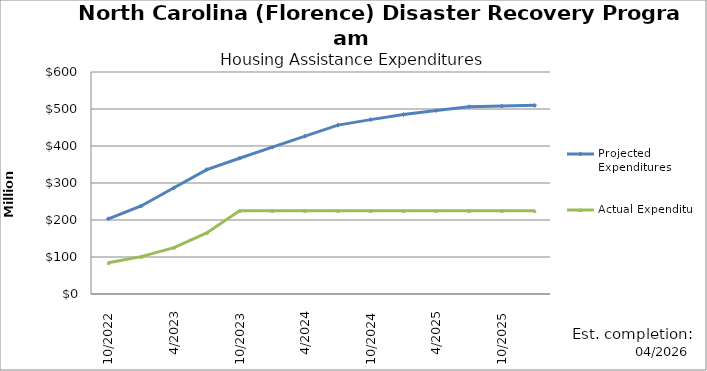
| Category | Projected Expenditures | Actual Expenditure |
|---|---|---|
| 10/2022 | 203220178 | 84420288.3 |
| 1/2023 | 237813733 | 100936743.25 |
| 4/2023 | 287019896 | 125438988.36 |
| 7/2023 | 336226060 | 165215608.73 |
| 10/2023 | 366986192 | 224875167.46 |
| 1/2024 | 396885984 | 224875167.46 |
| 4/2024 | 426646116 | 224875167.46 |
| 7/2024 | 456406248 | 224875167.46 |
| 10/2024 | 471243670 | 224875167.46 |
| 1/2025 | 484995804 | 224875167.46 |
| 4/2025 | 495961158 | 224875167.46 |
| 7/2025 | 506000072 | 224875167.46 |
| 10/2025 | 507899326 | 224875167.46 |
| 1/2026 | 509798580 | 224875167.46 |